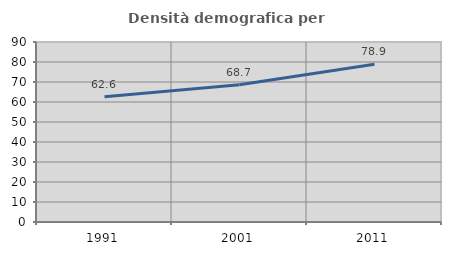
| Category | Densità demografica |
|---|---|
| 1991.0 | 62.579 |
| 2001.0 | 68.65 |
| 2011.0 | 78.866 |